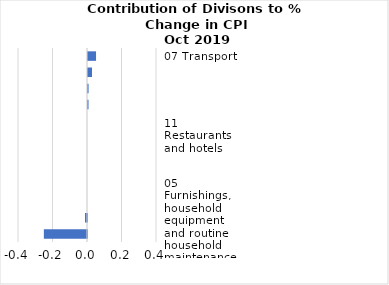
| Category |     Contributions |
|---|---|
| 07 Transport | 0.047 |
| 02 Alcoholic beverages, tobacco and narcotics | 0.023 |
| 04 Housing, water, electricity, gas and other fuels | 0.003 |
| 03 Clothing and footwear | 0.003 |
| 10 Education | 0 |
| 11 Restaurants and hotels | 0 |
| 06 Health | 0 |
| 08 Communication | 0 |
| 09 Recreation and culture | 0 |
| 12 Miscellaneous goods and services | 0 |
| 05 Furnishings, household equipment and routine household maintenance | -0.012 |
| 01 Food and non-alcoholic beverages | -0.25 |